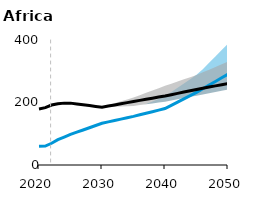
| Category | AFR ZCT Ref | AFR FOS Ref |
|---|---|---|
| 2020.0 | 60.241 | 179.498 |
| 2021.0 | 60.701 | 183.541 |
| 2022.0 | 69.536 | 191.928 |
| 2023.0 | 80.997 | 195.68 |
| 2024.0 | 89.438 | 197.994 |
| 2025.0 | 97.79 | 197.994 |
| 2026.0 | 104.956 | 195.369 |
| 2027.0 | 112.122 | 192.743 |
| 2028.0 | 119.288 | 190.118 |
| 2029.0 | 126.454 | 187.492 |
| 2030.0 | 133.62 | 184.867 |
| 2031.0 | 138.026 | 188.54 |
| 2032.0 | 142.431 | 192.213 |
| 2033.0 | 146.837 | 195.886 |
| 2034.0 | 151.243 | 199.56 |
| 2035.0 | 155.648 | 203.233 |
| 2036.0 | 160.638 | 206.771 |
| 2037.0 | 165.627 | 210.309 |
| 2038.0 | 170.616 | 213.848 |
| 2039.0 | 175.605 | 217.386 |
| 2040.0 | 180.594 | 220.924 |
| 2041.0 | 190.969 | 225.097 |
| 2042.0 | 201.344 | 229.27 |
| 2043.0 | 211.718 | 233.443 |
| 2044.0 | 222.094 | 237.616 |
| 2045.0 | 232.468 | 241.789 |
| 2046.0 | 244.119 | 245.585 |
| 2047.0 | 255.77 | 249.38 |
| 2048.0 | 267.42 | 253.175 |
| 2049.0 | 279.071 | 256.97 |
| 2050.0 | 290.722 | 260.765 |